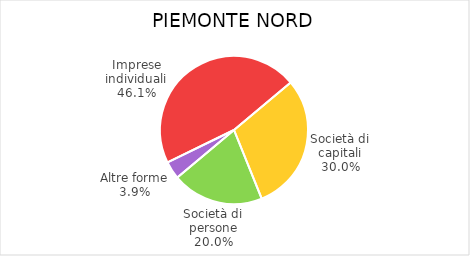
| Category | Piemonte Nord |
|---|---|
| Imprese individuali | 24994 |
| Società di capitali | 16245 |
| Società di persone | 10844 |
| Altre forme | 2100 |